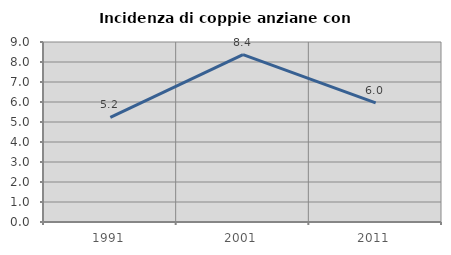
| Category | Incidenza di coppie anziane con figli |
|---|---|
| 1991.0 | 5.226 |
| 2001.0 | 8.37 |
| 2011.0 | 5.96 |